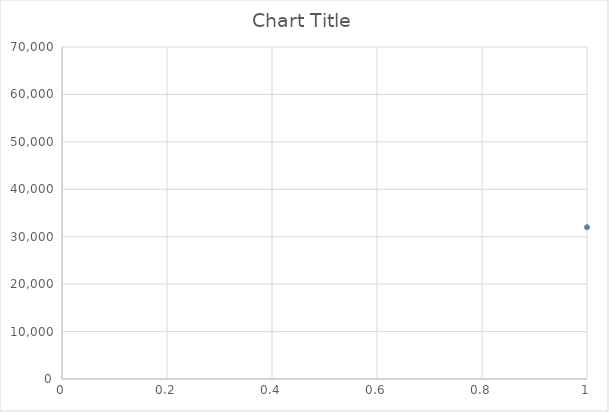
| Category | Series 0 |
|---|---|
| 0 | 32000 |
| 1 | 32200 |
| 2 | 30000 |
| 3 | 32600 |
| 4 | 32800 |
| 5 | 30800 |
| 6 | 41500 |
| 7 | 41000 |
| 8 | 41500 |
| 9 | 41000 |
| 10 | 50500 |
| 11 | 31800 |
| 12 | 31400 |
| 13 | 31000 |
| 14 | 31800 |
| 15 | 42000 |
| 16 | 43500 |
| 17 | 31600 |
| 18 | 31600 |
| 19 | 31000 |
| 20 | 31600 |
| 21 | 31800 |
| 22 | 31400 |
| 23 | 31000 |
| 24 | 31800 |
| 25 | 42500 |
| 26 | 44500 |
| 27 | 42000 |
| 28 | 43500 |
| 29 | 11000 |
| 30 | 13000 |
| 31 | 18000 |
| 32 | 21000 |
| 33 | 8700 |
| 34 | 8700 |
| 35 | 10900 |
| 36 | 10900 |
| 37 | 13600 |
| 38 | 13600 |
| 39 | 18000 |
| 40 | 18540 |
| 41 | 20300 |
| 42 | 20300 |
| 43 | 10900 |
| 44 | 14400 |
| 45 | 18000 |
| 46 | 21600 |
| 47 | 27600 |
| 48 | 22000 |
| 49 | 25000 |
| 50 | 28600 |
| 51 | 45000 |
| 52 | 45000 |
| 53 | 48000 |
| 54 | 66000 |
| 55 | 42000 |
| 56 | 42000 |
| 57 | 42000 |
| 58 | 54000 |
| 59 | 66000 |
| 60 | 26000 |
| 61 | 38000 |
| 62 | 38000 |
| 63 | 38000 |
| 64 | 38000 |
| 65 | 13600 |
| 66 | 21600 |
| 67 | 10000 |
| 68 | 12000 |
| 69 | 9800 |
| 70 | 11800 |
| 71 | 24000 |
| 72 | 9800 |
| 73 | 9800 |
| 74 | 12000 |
| 75 | 18000 |
| 76 | 25000 |
| 77 | 23600 |
| 78 | 24000 |
| 79 | 23800 |
| 80 | 24000 |
| 81 | 24000 |
| 82 | 24000 |
| 83 | 24000 |
| 84 | 23800 |
| 85 | 23800 |
| 86 | 23600 |
| 87 | 23200 |
| 88 | 23200 |
| 89 | 23000 |
| 90 | 22800 |
| 91 | 22800 |
| 92 | 22600 |
| 93 | 24000 |
| 94 | 24000 |
| 95 | 24000 |
| 96 | 24000 |
| 97 | 23400 |
| 98 | 23400 |
| 99 | 23600 |
| 100 | 23400 |
| 101 | 23400 |
| 102 | 23200 |
| 103 | 23200 |
| 104 | 23400 |
| 105 | 24000 |
| 106 | 23800 |
| 107 | 23800 |
| 108 | 23800 |
| 109 | 23800 |
| 110 | 23600 |
| 111 | 23400 |
| 112 | 23400 |
| 113 | 23200 |
| 114 | 23600 |
| 115 | 23400 |
| 116 | 23400 |
| 117 | 23200 |
| 118 | 23000 |
| 119 | 23000 |
| 120 | 23000 |
| 121 | 23000 |
| 122 | 23000 |
| 123 | 23000 |
| 124 | 23000 |
| 125 | 23000 |
| 126 | 22800 |
| 127 | 22800 |
| 128 | 22800 |
| 129 | 22800 |
| 130 | 22800 |
| 131 | 22800 |
| 132 | 23000 |
| 133 | 23000 |
| 134 | 23000 |
| 135 | 23000 |
| 136 | 23000 |
| 137 | 23000 |
| 138 | 23400 |
| 139 | 23400 |
| 140 | 23400 |
| 141 | 23400 |
| 142 | 23200 |
| 143 | 23200 |
| 144 | 23200 |
| 145 | 23000 |
| 146 | 23000 |
| 147 | 23400 |
| 148 | 23200 |
| 149 | 23200 |
| 150 | 23200 |
| 151 | 23200 |
| 152 | 23200 |
| 153 | 23200 |
| 154 | 23200 |
| 155 | 23000 |
| 156 | 23200 |
| 157 | 23000 |
| 158 | 23000 |
| 159 | 23200 |
| 160 | 23200 |
| 161 | 33400 |
| 162 | 35404 |
| 163 | 35738 |
| 164 | 33400 |
| 165 | 35000 |
| 166 | 33600 |
| 167 | 33200 |
| 168 | 33000 |
| 169 | 32800 |
| 170 | 34200 |
| 171 | 34000 |
| 172 | 33600 |
| 173 | 35200 |
| 174 | 34800 |
| 175 | 34600 |
| 176 | 33800 |
| 177 | 33600 |
| 178 | 33800 |
| 179 | 33600 |
| 180 | 33400 |
| 181 | 34000 |
| 182 | 34200 |
| 183 | 34000 |
| 184 | 33800 |
| 185 | 34000 |
| 186 | 34000 |
| 187 | 33800 |
| 188 | 34000 |
| 189 | 34000 |
| 190 | 33600 |
| 191 | 33600 |
| 192 | 33600 |
| 193 | 32800 |
| 194 | 33600 |
| 195 | 33600 |
| 196 | 33200 |
| 197 | 33200 |
| 198 | 33200 |
| 199 | 33200 |
| 200 | 33200 |
| 201 | 33200 |
| 202 | 34200 |
| 203 | 34200 |
| 204 | 33800 |
| 205 | 33800 |
| 206 | 33800 |
| 207 | 34000 |
| 208 | 33800 |
| 209 | 33800 |
| 210 | 33800 |
| 211 | 33800 |
| 212 | 33800 |
| 213 | 34000 |
| 214 | 34000 |
| 215 | 34000 |
| 216 | 34000 |
| 217 | 33800 |
| 218 | 33800 |
| 219 | 33800 |
| 220 | 33800 |
| 221 | 33800 |
| 222 | 33800 |
| 223 | 33800 |
| 224 | 45500 |
| 225 | 46500 |
| 226 | 46000 |
| 227 | 45500 |
| 228 | 45500 |
| 229 | 46000 |
| 230 | 46000 |
| 231 | 46000 |
| 232 | 55500 |
| 233 | 10000 |
| 234 | 12000 |
| 235 | 55500 |
| 236 | 33400 |
| 237 | 45500 |
| 238 | 23600 |
| 239 | 24000 |
| 240 | 11800 |
| 241 | 10900 |
| 242 | 18000 |
| 243 | 18000 |
| 244 | 18000 |
| 245 | 19000 |
| 246 | 19000 |
| 247 | 36000 |
| 248 | 36000 |
| 249 | 48000 |
| 250 | 48000 |
| 251 | 23000 |
| 252 | 23000 |
| 253 | 28000 |
| 254 | 28000 |
| 255 | 23600 |
| 256 | 24000 |
| 257 | 23800 |
| 258 | 24000 |
| 259 | 24000 |
| 260 | 24000 |
| 261 | 24000 |
| 262 | 23800 |
| 263 | 23800 |
| 264 | 23600 |
| 265 | 23200 |
| 266 | 23200 |
| 267 | 23000 |
| 268 | 22800 |
| 269 | 22800 |
| 270 | 22600 |
| 271 | 24000 |
| 272 | 24000 |
| 273 | 24000 |
| 274 | 24000 |
| 275 | 23400 |
| 276 | 23400 |
| 277 | 23600 |
| 278 | 23400 |
| 279 | 23400 |
| 280 | 23200 |
| 281 | 23200 |
| 282 | 23400 |
| 283 | 24000 |
| 284 | 23800 |
| 285 | 23800 |
| 286 | 23800 |
| 287 | 23800 |
| 288 | 23600 |
| 289 | 23400 |
| 290 | 23400 |
| 291 | 23200 |
| 292 | 23600 |
| 293 | 23400 |
| 294 | 23400 |
| 295 | 23200 |
| 296 | 23000 |
| 297 | 23000 |
| 298 | 23000 |
| 299 | 23000 |
| 300 | 23000 |
| 301 | 23000 |
| 302 | 23000 |
| 303 | 23000 |
| 304 | 22800 |
| 305 | 22800 |
| 306 | 22800 |
| 307 | 22800 |
| 308 | 22800 |
| 309 | 22800 |
| 310 | 23000 |
| 311 | 23000 |
| 312 | 23000 |
| 313 | 23000 |
| 314 | 23000 |
| 315 | 23000 |
| 316 | 23400 |
| 317 | 23400 |
| 318 | 23400 |
| 319 | 23400 |
| 320 | 23200 |
| 321 | 23200 |
| 322 | 23200 |
| 323 | 23000 |
| 324 | 23000 |
| 325 | 23400 |
| 326 | 23200 |
| 327 | 23200 |
| 328 | 23200 |
| 329 | 23200 |
| 330 | 23200 |
| 331 | 23200 |
| 332 | 23200 |
| 333 | 23000 |
| 334 | 23200 |
| 335 | 23000 |
| 336 | 23000 |
| 337 | 23200 |
| 338 | 23200 |
| 339 | 23200 |
| 340 | 33400 |
| 341 | 35404 |
| 342 | 35738 |
| 343 | 33400 |
| 344 | 35000 |
| 345 | 33600 |
| 346 | 33200 |
| 347 | 33000 |
| 348 | 32800 |
| 349 | 34200 |
| 350 | 34000 |
| 351 | 33600 |
| 352 | 35200 |
| 353 | 34800 |
| 354 | 34600 |
| 355 | 33800 |
| 356 | 33600 |
| 357 | 33800 |
| 358 | 33600 |
| 359 | 33400 |
| 360 | 34000 |
| 361 | 34200 |
| 362 | 34000 |
| 363 | 33800 |
| 364 | 34000 |
| 365 | 34000 |
| 366 | 33800 |
| 367 | 34000 |
| 368 | 34000 |
| 369 | 33600 |
| 370 | 33600 |
| 371 | 33600 |
| 372 | 32800 |
| 373 | 33600 |
| 374 | 33600 |
| 375 | 33200 |
| 376 | 33200 |
| 377 | 33200 |
| 378 | 33200 |
| 379 | 33200 |
| 380 | 33200 |
| 381 | 34200 |
| 382 | 34200 |
| 383 | 33800 |
| 384 | 33800 |
| 385 | 33800 |
| 386 | 34000 |
| 387 | 33800 |
| 388 | 33800 |
| 389 | 33800 |
| 390 | 33800 |
| 391 | 33800 |
| 392 | 34000 |
| 393 | 34000 |
| 394 | 34000 |
| 395 | 34000 |
| 396 | 33800 |
| 397 | 33800 |
| 398 | 33800 |
| 399 | 33800 |
| 400 | 33800 |
| 401 | 33800 |
| 402 | 33800 |
| 403 | 45500 |
| 404 | 46500 |
| 405 | 46000 |
| 406 | 45500 |
| 407 | 45500 |
| 408 | 46000 |
| 409 | 46000 |
| 410 | 46000 |
| 411 | 55500 |
| 412 | 19000 |
| 413 | 24000 |
| 414 | 18000 |
| 415 | 10000 |
| 416 | 12000 |
| 417 | 9000 |
| 418 | 13000 |
| 419 | 19000 |
| 420 | 10900 |
| 421 | 11800 |
| 422 | 24000 |
| 423 | 18000 |
| 424 | 10000 |
| 425 | 12000 |
| 426 | 9800 |
| 427 | 11800 |
| 428 | 24000 |
| 429 | 12000 |
| 430 | 16000 |
| 431 | 18000 |
| 432 | 12000 |
| 433 | 14400 |
| 434 | 18000 |
| 435 | 21600 |
| 436 | 25400 |
| 437 | 18900 |
| 438 | 24000 |
| 439 | 18295 |
| 440 | 18056 |
| 441 | 13679 |
| 442 | 10089 |
| 443 | 10942 |
| 444 | 18940 |
| 445 | 24000 |
| 446 | 10000 |
| 447 | 13500 |
| 448 | 16200 |
| 449 | 21600 |
| 450 | 23600 |
| 451 | 35000 |
| 452 | 45500 |
| 453 | 50000 |
| 454 | 23400 |
| 455 | 10000 |
| 456 | 12000 |
| 457 | 9800 |
| 458 | 11800 |
| 459 | 24000 |
| 460 | 9800 |
| 461 | 11800 |
| 462 | 18000 |
| 463 | 25000 |
| 464 | 11000 |
| 465 | 13000 |
| 466 | 8806.37 |